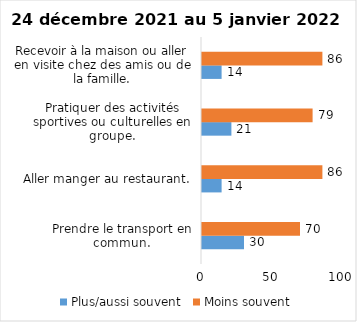
| Category | Plus/aussi souvent | Moins souvent |
|---|---|---|
| Prendre le transport en commun. | 30 | 70 |
| Aller manger au restaurant. | 14 | 86 |
| Pratiquer des activités sportives ou culturelles en groupe. | 21 | 79 |
| Recevoir à la maison ou aller en visite chez des amis ou de la famille. | 14 | 86 |